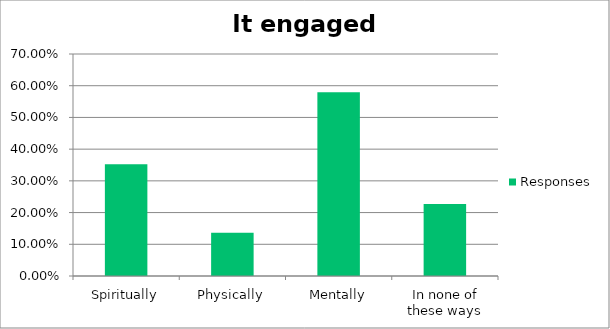
| Category | Responses |
|---|---|
| Spiritually | 0.352 |
| Physically | 0.136 |
| Mentally | 0.58 |
| In none of these ways | 0.227 |